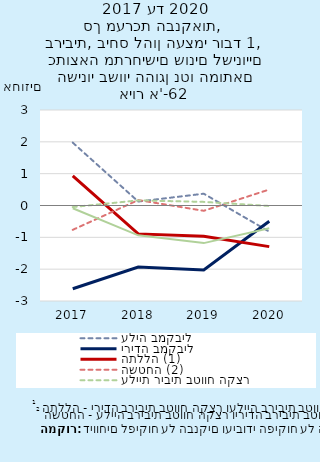
| Category | עליה במקביל | ירידה במקביל | התללה (1) | השטחה (2) | עליית ריבית בטווח הקצר | ירידת ריבית בטווח הקצר |
|---|---|---|---|---|---|---|
| 2017-12-31 | 1.975 | -2.616 | 0.927 | -0.764 | -0.049 | -0.088 |
| 2018-12-31 | 0.124 | -1.933 | -0.892 | 0.171 | 0.161 | -0.937 |
| 2019-12-31 | 0.371 | -2.025 | -0.963 | -0.166 | 0.114 | -1.181 |
| 2020-12-31 | -0.82 | -0.493 | -1.292 | 0.502 | -0.015 | -0.716 |